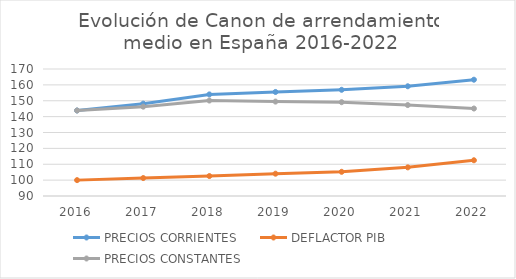
| Category | PRECIOS CORRIENTES | DEFLACTOR PIB | PRECIOS CONSTANTES |
|---|---|---|---|
| 2016.0 | 143.86 | 100 | 143.86 |
| 2017.0 | 148.18 | 101.3 | 146.278 |
| 2018.0 | 153.991 | 102.566 | 150.138 |
| 2019.0 | 155.537 | 104.053 | 149.478 |
| 2020.0 | 156.905 | 105.24 | 149.093 |
| 2021.0 | 159.12 | 108.039 | 147.28 |
| 2022.0 | 163.253 | 112.512 | 145.099 |